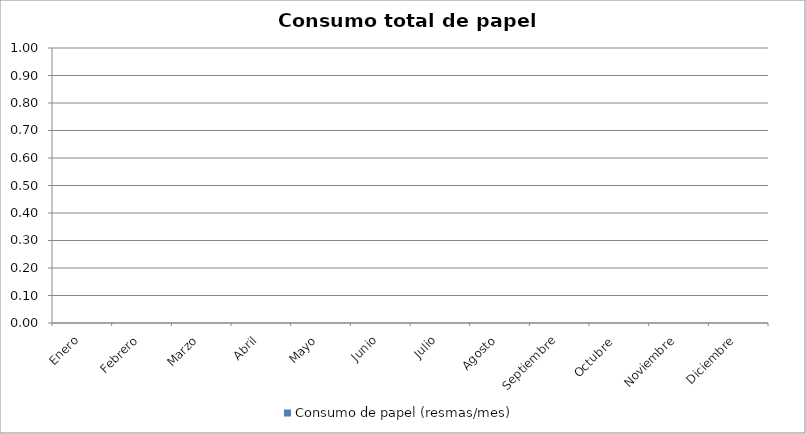
| Category | Consumo de papel (resmas/mes) |
|---|---|
| Enero | 0 |
| Febrero | 0 |
| Marzo | 0 |
| Abril | 0 |
| Mayo | 0 |
| Junio | 0 |
| Julio | 0 |
| Agosto | 0 |
| Septiembre | 0 |
| Octubre  | 0 |
| Noviembre | 0 |
| Diciembre | 0 |